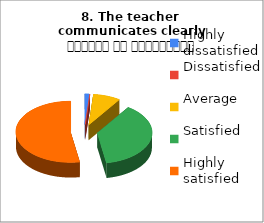
| Category | 8. The teacher 
communicates clearly शिक्षक का सम्प्रेषण सुस्पष्ट है |
|---|---|
| Highly dissatisfied | 1 |
| Dissatisfied | 0 |
| Average | 6 |
| Satisfied | 28 |
| Highly satisfied | 39 |